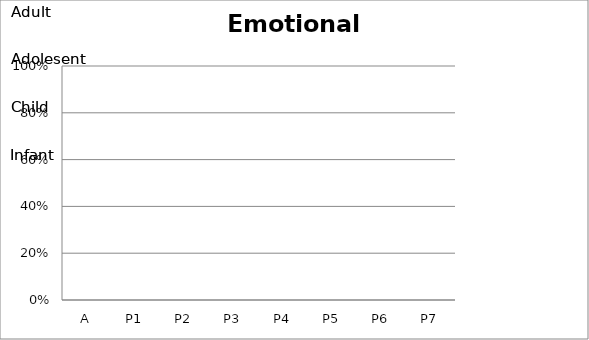
| Category | Series 1 |
|---|---|
| A | 0 |
| P1 | 0 |
| P2 | 0 |
| P3 | 0 |
| P4 | 0 |
| P5 | 0 |
| P6 | 0 |
| P7 | 0 |